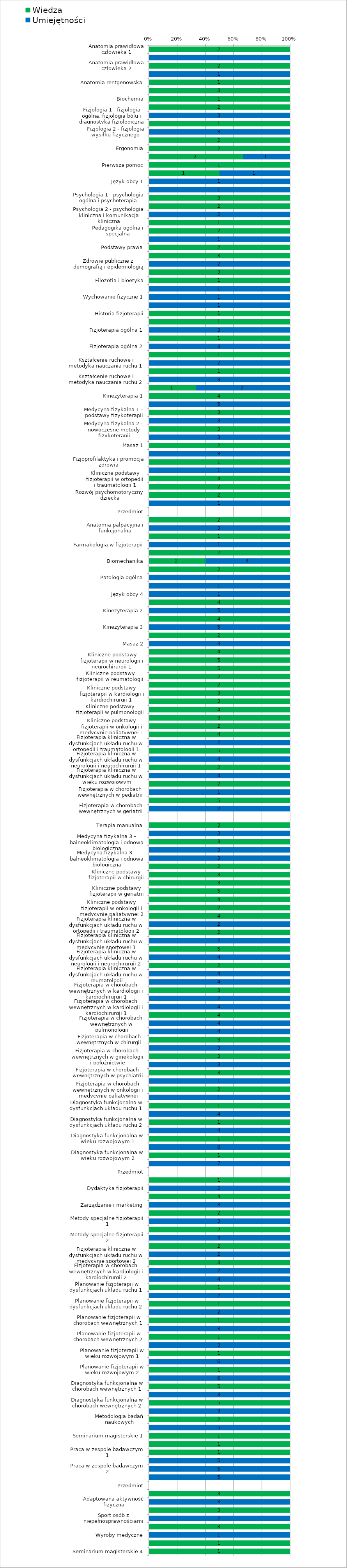
| Category | Wiedza | Umiejętności |
|---|---|---|
| Anatomia prawidłowa człowieka 1 | 2 | 0 |
| Anatomia prawidłowa człowieka 1 | 0 | 1 |
| Anatomia prawidłowa człowieka 2 | 2 | 0 |
| Anatomia prawidłowa człowieka 2 | 0 | 1 |
| Anatomia rentgenowska | 1 | 0 |
| Biologia medyczna z genetyką | 3 | 0 |
| Biochemia | 1 | 0 |
| Fizjologia 1 - fizjologia ogólna, fizjologia bólu i diagnostyka fizjologiczna | 2 | 0 |
| Fizjologia 1 - fizjologia ogólna, fizjologia bólu i diagnostyka fizjologiczna | 0 | 3 |
| Fizjologia 2 - fizjologia wysiłku fizycznego | 1 | 0 |
| Fizjologia 2 - fizjologia wysiłku fizycznego | 0 | 3 |
| Biofizyka | 2 | 0 |
| Ergonomia | 2 | 0 |
| Ergonomia | 2 | 1 |
| Pierwsza pomoc | 1 | 0 |
| Pierwsza pomoc | 1 | 1 |
| Język obcy 1 | 0 | 1 |
| Język obcy 2 | 0 | 1 |
| Psychologia 1 - psychologia ogólna i psychoterapia | 3 | 0 |
| Psychologia 2 - psychologia kliniczna i komunikacja kliniczna | 2 | 0 |
| Psychologia 2 - psychologia kliniczna i komunikacja kliniczna | 0 | 2 |
| Socjologia ogólna i niepełnosprawności | 1 | 0 |
| Pedagogika ogólna i specjalna | 2 | 0 |
| Pedagogika ogólna i specjalna | 0 | 1 |
| Podstawy prawa | 2 | 0 |
| Zdrowie publiczne z demografią i epidemiologią | 3 | 0 |
| Zdrowie publiczne z demografią i epidemiologią | 0 | 2 |
| Ekonomia, system ochrony zdrowia i technologie informacyjne | 3 | 0 |
| Filozofia i bioetyka | 1 | 0 |
| Filozofia i bioetyka | 0 | 1 |
| Wychowanie fizyczne 1 | 0 | 1 |
| Wychowanie fizyczne 2 | 0 | 1 |
| Historia fizjoterapii | 1 | 0 |
| Fizjoterapia ogólna 1 | 1 | 0 |
| Fizjoterapia ogólna 1 | 0 | 3 |
| Fizjoterapia ogólna 2 | 1 | 0 |
| Fizjoterapia ogólna 2 | 0 | 3 |
| Kształcenie ruchowe i metodyka nauczania ruchu 1 | 1 | 0 |
| Kształcenie ruchowe i metodyka nauczania ruchu 1 | 0 | 2 |
| Kształcenie ruchowe i metodyka nauczania ruchu 2 | 1 | 0 |
| Kształcenie ruchowe i metodyka nauczania ruchu 2 | 0 | 3 |
| Kształcenie ruchowe i metodyka nauczania ruchu 3 - pływanie | 1 | 2 |
| Kinezyterapia 1 | 4 | 0 |
| Kinezyterapia 1 | 0 | 5 |
| Medycyna fizykalna 1 – podstawy fizykoterapii | 3 | 0 |
| Medycyna fizykalna 1 – podstawy fizykoterapii | 0 | 3 |
| Medycyna fizykalna 2 – nowoczesne metody fizykoterapii | 3 | 0 |
| Medycyna fizykalna 2 – nowoczesne metody fizykoterapii | 0 | 3 |
| Masaż 1 | 2 | 0 |
| Masaż 1 | 0 | 3 |
| Fizjoprofilaktyka i promocja zdrowia | 1 | 0 |
| Fizjoprofilaktyka i promocja zdrowia | 0 | 1 |
| Kliniczne podstawy fizjoterapii w ortopedii i traumatologii 1 | 4 | 0 |
| Kliniczne podstawy fizjoterapii w pediatrii | 2 | 0 |
| Rozwój psychomotoryczny dziecka | 2 | 0 |
| Rozwój psychomotoryczny dziecka | 0 | 1 |
| Przedmiot | 0 | 0 |
| Anatomia palpacyjna i funkcjonalna | 2 | 0 |
| Anatomia palpacyjna i funkcjonalna | 0 | 3 |
| Farmakologia w fizjoterapii | 1 | 0 |
| Farmakologia w fizjoterapii | 0 | 1 |
| Biomechanika | 2 | 0 |
| Biomechanika | 2 | 3 |
| Patologia ogólna | 2 | 0 |
| Patologia ogólna | 0 | 1 |
| Język obcy 3 | 0 | 1 |
| Język obcy 4 | 0 | 1 |
| Kinezyterapia 2 | 4 | 0 |
| Kinezyterapia 2 | 0 | 5 |
| Kinezyterapia 3 | 4 | 0 |
| Kinezyterapia 3 | 0 | 5 |
| Masaż 2 | 2 | 0 |
| Masaż 2 | 0 | 3 |
| Kliniczne podstawy fizjoterapii w ortopedii i traumatologii 2 | 4 | 0 |
| Kliniczne podstawy fizjoterapii w neurologii i neurochirurgii 1 | 5 | 0 |
| Kliniczne podstawy fizjoterapii w neurologii i neurochirurgii 2 | 5 | 0 |
| Kliniczne podstawy fizjoterapii w reumatologii | 2 | 0 |
| Kliniczne podstawy fizjoterapii w neurologii dziecięcej | 2 | 0 |
| Kliniczne podstawy fizjoterapii w kardiologii i kardiochirurgii 1 | 3 | 0 |
| Kliniczne podstawy fizjoterapii w kardiologii i kardiochirurgii 2 | 3 | 0 |
| Kliniczne podstawy fizjoterapii w pulmonologii | 4 | 0 |
| Kliniczne podstawy fizjoterapii w ginekologii i położnictwie | 3 | 0 |
| Kliniczne podstawy fizjoterapii w onkologii i medycynie paliatywnej 1 | 2 | 0 |
| Fizjoterapia kliniczna w dysfunkcjach układu ruchu w ortopedii i traumatologii 1 | 4 | 0 |
| Fizjoterapia kliniczna w dysfunkcjach układu ruchu w ortopedii i traumatologii 1 | 0 | 2 |
| Fizjoterapia kliniczna w dysfunkcjach układu ruchu w neurologii i neurochirurgii 1 | 5 | 0 |
| Fizjoterapia kliniczna w dysfunkcjach układu ruchu w neurologii i neurochirurgii 1 | 0 | 4 |
| Fizjoterapia kliniczna w dysfunkcjach układu ruchu w wieku rozwojowym | 2 | 0 |
| Fizjoterapia kliniczna w dysfunkcjach układu ruchu w wieku rozwojowym | 0 | 4 |
| Fizjoterapia w chorobach wewnętrznych w pediatrii | 2 | 0 |
| Fizjoterapia w chorobach wewnętrznych w pediatrii | 0 | 1 |
| Fizjoterapia w chorobach wewnętrznych w geriatrii | 5 | 0 |
| Fizjoterapia w chorobach wewnętrznych w geriatrii | 0 | 2 |
| Przedmiot | 0 | 0 |
| Terapia manualna | 3 | 0 |
| Terapia manualna | 0 | 3 |
| Medycyna fizykalna 3 – balneoklimatologia i odnowa biologiczna | 3 | 0 |
| Medycyna fizykalna 3 – balneoklimatologia i odnowa biologiczna | 0 | 3 |
| Medycyna fizykalna 3 – balneoklimatologia i odnowa biologiczna | 0 | 3 |
| Kliniczne podstawy fizjoterapii w medycynie sportowej | 2 | 0 |
| Kliniczne podstawy fizjoterapii w chirurgii | 3 | 0 |
| Kliniczne podstawy fizjoterapii w psychiatrii | 3 | 0 |
| Kliniczne podstawy fizjoterapii w geriatrii | 5 | 0 |
| Kliniczne podstawy fizjoterapii w intensywnej terapii | 4 | 0 |
| Kliniczne podstawy fizjoterapii w onkologii i medycynie paliatywnej 2 | 2 | 0 |
| Fizjoterapia kliniczna w dysfunkcjach układu ruchu w ortopedii i traumatologii 2 | 4 | 0 |
| Fizjoterapia kliniczna w dysfunkcjach układu ruchu w ortopedii i traumatologii 2 | 0 | 2 |
| Fizjoterapia kliniczna w dysfunkcjach układu ruchu w medycynie sportowej 1 | 2 | 0 |
| Fizjoterapia kliniczna w dysfunkcjach układu ruchu w medycynie sportowej 1 | 0 | 2 |
| Fizjoterapia kliniczna w dysfunkcjach układu ruchu w neurologii i neurochirurgii 2 | 5 | 0 |
| Fizjoterapia kliniczna w dysfunkcjach układu ruchu w neurologii i neurochirurgii 2 | 0 | 4 |
| Fizjoterapia kliniczna w dysfunkcjach układu ruchu w reumatologii | 2 | 0 |
| Fizjoterapia kliniczna w dysfunkcjach układu ruchu w reumatologii | 0 | 4 |
| Fizjoterapia kliniczna w dysfunkcjach układu ruchu w reumatologii | 0 | 4 |
| Fizjoterapia w chorobach wewnętrznych w kardiologii i kardiochirurgii 1 | 3 | 0 |
| Fizjoterapia w chorobach wewnętrznych w kardiologii i kardiochirurgii 1 | 0 | 2 |
| Fizjoterapia w chorobach wewnętrznych w kardiologii i kardiochirurgii 1 | 0 | 4 |
| Fizjoterapia w chorobach wewnętrznych w pulmonologii | 4 | 0 |
| Fizjoterapia w chorobach wewnętrznych w pulmonologii | 0 | 4 |
| Fizjoterapia w chorobach wewnętrznych w pulmonologii | 0 | 4 |
| Fizjoterapia w chorobach wewnętrznych w chirurgii  | 3 | 0 |
| Fizjoterapia w chorobach wewnętrznych w chirurgii  | 0 | 3 |
| Fizjoterapia w chorobach wewnętrznych w ginekologii i położnictwie | 3 | 0 |
| Fizjoterapia w chorobach wewnętrznych w ginekologii i położnictwie | 0 | 3 |
| Fizjoterapia w chorobach wewnętrznych w psychiatrii | 3 | 0 |
| Fizjoterapia w chorobach wewnętrznych w psychiatrii | 0 | 1 |
| Fizjoterapia w chorobach wewnętrznych w onkologii i medycynie paliatywnej | 2 | 0 |
| Fizjoterapia w chorobach wewnętrznych w onkologii i medycynie paliatywnej | 0 | 1 |
| Diagnostyka funkcjonalna w dysfunkcjach układu ruchu 1 | 1 | 0 |
| Diagnostyka funkcjonalna w dysfunkcjach układu ruchu 1 | 0 | 4 |
| Diagnostyka funkcjonalna w dysfunkcjach układu ruchu 2 | 1 | 0 |
| Diagnostyka funkcjonalna w dysfunkcjach układu ruchu 2 | 0 | 4 |
| Diagnostyka funkcjonalna w wieku rozwojowym 1 | 1 | 0 |
| Diagnostyka funkcjonalna w wieku rozwojowym 1 | 0 | 8 |
| Diagnostyka funkcjonalna w wieku rozwojowym 2 | 1 | 0 |
| Diagnostyka funkcjonalna w wieku rozwojowym 2 | 0 | 7 |
| Przedmiot | 0 | 0 |
| Dydaktyka fizjoterapii | 1 | 0 |
| Dydaktyka fizjoterapii | 0 | 2 |
| Zarządzanie i marketing | 4 | 0 |
| Zarządzanie i marketing | 0 | 3 |
| Metody specjalne fizjoterapii 1 | 2 | 0 |
| Metody specjalne fizjoterapii 1 | 0 | 3 |
| Metody specjalne fizjoterapii 2 | 2 | 0 |
| Metody specjalne fizjoterapii 2 | 0 | 3 |
| Fizjoterapia kliniczna w dysfunkcjach układu ruchu w medycynie sportowej 2 | 2 | 0 |
| Fizjoterapia kliniczna w dysfunkcjach układu ruchu w medycynie sportowej 2 | 0 | 2 |
| Fizjoterapia w chorobach wewnętrznych w kardiologii i kardiochirurgii 2 | 3 | 0 |
| Fizjoterapia w chorobach wewnętrznych w kardiologii i kardiochirurgii 2 | 0 | 2 |
| Fizjoterapia w chorobach wewnętrznych w kardiologii i kardiochirurgii 2 | 0 | 4 |
| Planowanie fizjoterapii w dysfunkcjach układu ruchu 1 | 1 | 0 |
| Planowanie fizjoterapii w dysfunkcjach układu ruchu 1 | 0 | 2 |
| Planowanie fizjoterapii w dysfunkcjach układu ruchu 2 | 1 | 0 |
| Planowanie fizjoterapii w dysfunkcjach układu ruchu 2 | 0 | 2 |
| Planowanie fizjoterapii w chorobach wewnętrznych 1 | 1 | 0 |
| Planowanie fizjoterapii w chorobach wewnętrznych 1 | 0 | 3 |
| Planowanie fizjoterapii w chorobach wewnętrznych 2 | 1 | 0 |
| Planowanie fizjoterapii w chorobach wewnętrznych 2 | 0 | 3 |
| Planowanie fizjoterapii w wieku rozwojowym 1 | 1 | 0 |
| Planowanie fizjoterapii w wieku rozwojowym 1 | 0 | 6 |
| Planowanie fizjoterapii w wieku rozwojowym 2 | 1 | 0 |
| Planowanie fizjoterapii w wieku rozwojowym 2 | 0 | 6 |
| Diagnostyka funkcjonalna w chorobach wewnętrznych 1 | 5 | 0 |
| Diagnostyka funkcjonalna w chorobach wewnętrznych 1 | 0 | 3 |
| Diagnostyka funkcjonalna w chorobach wewnętrznych 2 | 5 | 0 |
| Diagnostyka funkcjonalna w chorobach wewnętrznych 2 | 0 | 3 |
| Metodologia badań naukowych | 2 | 0 |
| Metodologia badań naukowych | 0 | 5 |
| Seminarium magisterskie 1 | 1 | 0 |
| Seminarium magisterskie 2 | 1 | 0 |
| Praca w zespole badawczym 1 | 1 | 0 |
| Praca w zespole badawczym 1 | 0 | 5 |
| Praca w zespole badawczym 2 | 0 | 5 |
| Praca w zespole badawczym 2 | 0 | 5 |
| Przedmiot | 0 | 0 |
| Adaptowana aktywność fizyczna | 3 | 0 |
| Adaptowana aktywność fizyczna | 0 | 3 |
| Sport osób z niepełnosprawnościami | 3 | 0 |
| Sport osób z niepełnosprawnościami | 0 | 2 |
| Wyroby medyczne | 3 | 0 |
| Wyroby medyczne | 0 | 1 |
| Seminarium magisterskie 3 | 1 | 0 |
| Seminarium magisterskie 4 | 1 | 0 |